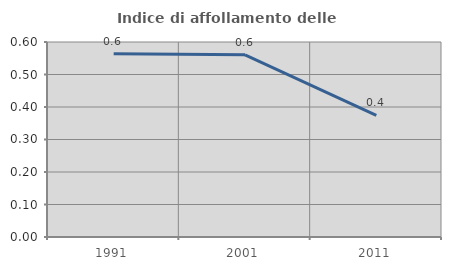
| Category | Indice di affollamento delle abitazioni  |
|---|---|
| 1991.0 | 0.564 |
| 2001.0 | 0.56 |
| 2011.0 | 0.375 |